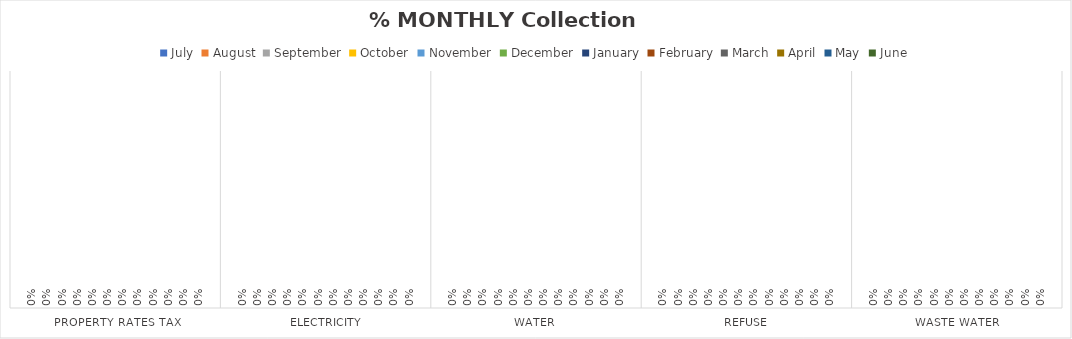
| Category | July | August | September | October | November | December | January | February | March | April | May | June |
|---|---|---|---|---|---|---|---|---|---|---|---|---|
| Property Rates Tax | 0 | 0 | 0 | 0 | 0 | 0 | 0 | 0 | 0 | 0 | 0 | 0 |
| Electricity | 0 | 0 | 0 | 0 | 0 | 0 | 0 | 0 | 0 | 0 | 0 | 0 |
| Water | 0 | 0 | 0 | 0 | 0 | 0 | 0 | 0 | 0 | 0 | 0 | 0 |
| Refuse | 0 | 0 | 0 | 0 | 0 | 0 | 0 | 0 | 0 | 0 | 0 | 0 |
| Waste Water | 0 | 0 | 0 | 0 | 0 | 0 | 0 | 0 | 0 | 0 | 0 | 0 |